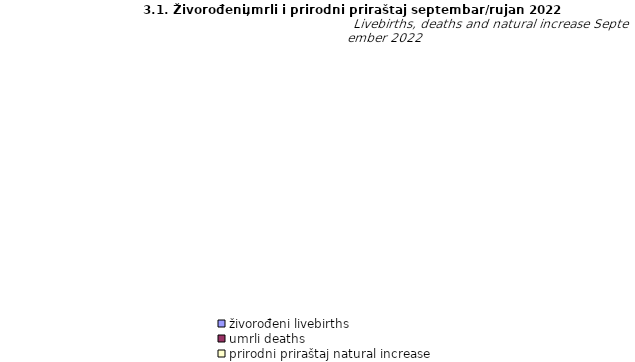
| Category | živorođeni livebirths | umrli deaths | prirodni priraštaj natural increase |
|---|---|---|---|
| Unsko - sanski | 153 | 190 | -37 |
| Kanton Posavski | 11 | 37 | -26 |
| Tuzlanski | 325 | 358 | -33 |
| Zeničko - dobojski | 306 | 328 | -22 |
| Bosansko - podrinjski | 7 | 26 | -19 |
| Srednjobosanski | 153 | 198 | -45 |
| Hercegovačko-neretvanski | 155 | 170 | -15 |
| Zapadnohercegovački | 75 | 73 | 2 |
| Kanton Sarajevo | 346 | 376 | -30 |
| Kanton 10 | 33 | 59 | -26 |